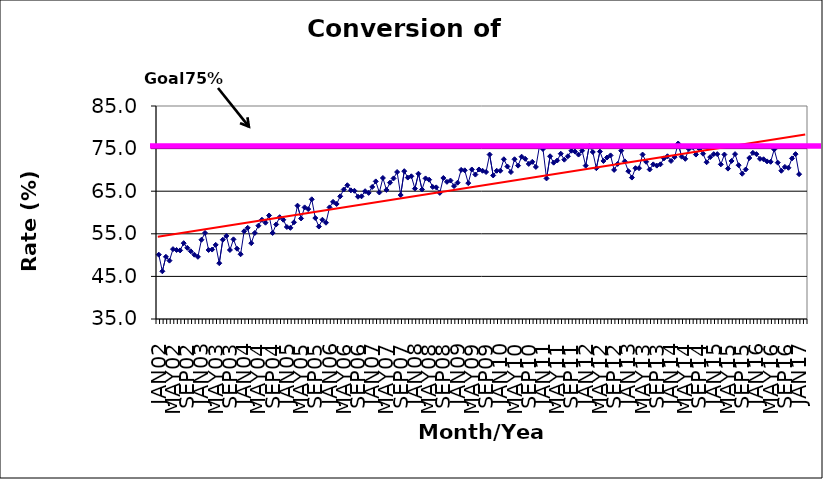
| Category | Series 0 |
|---|---|
| JAN02 | 50.1 |
| FEB02 | 46.2 |
| MAR02 | 49.6 |
| APR02 | 48.7 |
| MAY02 | 51.4 |
| JUN02 | 51.2 |
| JUL02 | 51.1 |
| AUG02 | 52.8 |
| SEP02 | 51.7 |
| OCT02 | 50.9 |
| NOV02 | 50.1 |
| DEC02 | 49.6 |
| JAN03 | 53.6 |
| FEB03 | 55.2 |
| MAR03 | 51.2 |
| APR03 | 51.3 |
| MAY03 | 52.4 |
| JUN03 | 48.1 |
| JUL03 | 53.6 |
| AUG03 | 54.5 |
| SEP03 | 51.2 |
| OCT03 | 53.7 |
| NOV03 | 51.5 |
| DEC03 | 50.2 |
| JAN04 | 55.6 |
| FEB04 | 56.4 |
| MAR04 | 52.8 |
| APR04 | 55.2 |
| MAY04 | 56.9 |
| JUN04 | 58.3 |
| JUL04 | 57.6 |
| AUG04 | 59.3 |
| SEP04 | 55.2 |
| OCT04 | 57.2 |
| NOV04 | 58.9 |
| DEC04 | 58.3 |
| JAN05 | 56.6 |
| FEB05 | 56.4 |
| MAR05 | 57.7 |
| APR05 | 61.6 |
| MAY05 | 58.6 |
| JUN05 | 61.2 |
| JUL05 | 60.8 |
| AUG05 | 63.1 |
| SEP05 | 58.7 |
| OCT05 | 56.7 |
| NOV05 | 58.3 |
| DEC05 | 57.6 |
| JAN06 | 61.2 |
| FEB06 | 62.5 |
| MAR06 | 62 |
| APR06 | 63.8 |
| MAY06 | 65.4 |
| JUN06 | 66.4 |
| JUL06 | 65.2 |
| AUG06 | 65.1 |
| SEP06 | 63.7 |
| OCT06 | 63.8 |
| NOV06 | 65 |
| DEC06 | 64.6 |
| JAN07 | 66 |
| FEB07 | 67.3 |
| MAR07 | 64.7 |
| APR07 | 68.1 |
| MAY07 | 65.3 |
| JUN07 | 67 |
| JUL07 | 68 |
| AUG07 | 69.5 |
| SEP07 | 64.1 |
| OCT07 | 69.7 |
| NOV07 | 68.2 |
| DEC07 | 68.5 |
| JAN08 | 65.6 |
| FEB08 | 69.1 |
| MAR08 | 65.4 |
| APR08 | 68 |
| MAY08 | 67.7 |
| JUN08 | 66 |
| JUL08 | 65.9 |
| AUG08 | 64.6 |
| SEP08 | 68.1 |
| OCT08 | 67.2 |
| NOV08 | 67.5 |
| DEC08 | 66.2 |
| JAN09 | 67 |
| FEB09 | 70 |
| MAR09 | 69.9 |
| APR09 | 66.9 |
| MAY09 | 70.1 |
| JUN09 | 68.9 |
| JUL09 | 70.1 |
| AUG09 | 69.8 |
| SEP09 | 69.5 |
| OCT09 | 73.6 |
| NOV09 | 68.7 |
| DEC09 | 69.8 |
| JAN10 | 69.8 |
| FEB10 | 72.5 |
| MAR10 | 70.8 |
| APR10 | 69.5 |
| MAY10 | 72.5 |
| JUN10 | 71 |
| JUL10 | 73.1 |
| AUG10 | 72.6 |
| SEP10 | 71.4 |
| OCT10 | 71.9 |
| NOV10 | 70.7 |
| DEC10 | 75.5 |
| JAN11 | 74.9 |
| FEB11 | 68 |
| MAR11 | 73.2 |
| APR11 | 71.7 |
| MAY11 | 72.2 |
| JUN11 | 73.8 |
| JUL11 | 72.4 |
| AUG11 | 73.2 |
| SEP11 | 74.5 |
| OCT11 | 74.3 |
| NOV11 | 73.6 |
| DEC11 | 74.5 |
| JAN12 | 71 |
| FEB12 | 75.6 |
| MAR12 | 74.2 |
| APR12 | 70.4 |
| MAY12 | 74.3 |
| JUN12 | 72.1 |
| JUL12 | 72.9 |
| AUG12 | 73.4 |
| SEP12 | 70 |
| OCT12 | 71.4 |
| NOV12 | 74.5 |
| DEC12 | 72 |
| JAN13 | 69.7 |
| FEB13 | 68.2 |
| MAR13 | 70.4 |
| APR13 | 70.4 |
| MAY13 | 73.6 |
| JUN13 | 71.9 |
| JUL13 | 70.1 |
| AUG13 | 71.3 |
| SEP13 | 71 |
| OCT13 | 71.3 |
| NOV13 | 72.7 |
| DEC13 | 73.2 |
| JAN14 | 72.1 |
| FEB14 | 73 |
| MAR14 | 76.2 |
| APR14 | 73.1 |
| MAY14 | 72.6 |
| JUN14 | 74.9 |
| JUL14 | 75.4 |
| AUG14 | 73.6 |
| SEP14 | 74.9 |
| OCT14 | 73.8 |
| NOV14 | 71.8 |
| DEC14 | 73 |
| JAN15 | 73.7 |
| FEB15 | 73.7 |
| MAR15 | 71.3 |
| APR15 | 73.6 |
| MAY15 | 70.3 |
| JUN15 | 72.1 |
| JUL15 | 73.7 |
| AUG15 | 71.1 |
| SEP15 | 69.1 |
| OCT15 | 70.1 |
| NOV15 | 72.8 |
| DEC15 | 74 |
| JAN16 | 73.7 |
| FEB16 | 72.6 |
| MAR16 | 72.5 |
| APR16 | 72 |
| MAY16 | 71.9 |
| JUN16 | 74.8 |
| JUL16 | 71.7 |
| AUG16 | 69.8 |
| SEP16 | 70.7 |
| OCT16 | 70.5 |
| NOV16 | 72.7 |
| DEC16 | 73.7 |
| JAN17 | 69 |